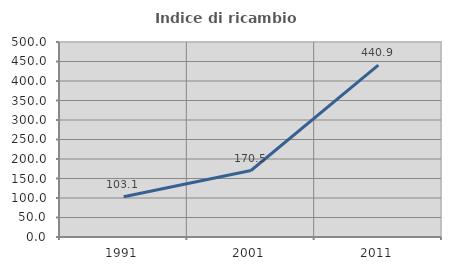
| Category | Indice di ricambio occupazionale  |
|---|---|
| 1991.0 | 103.07 |
| 2001.0 | 170.513 |
| 2011.0 | 440.881 |